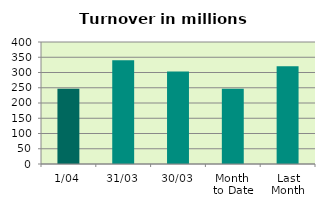
| Category | Series 0 |
|---|---|
| 1/04 | 247.042 |
| 31/03 | 339.927 |
| 30/03 | 302.961 |
| Month 
to Date | 247.042 |
| Last
Month | 320.663 |